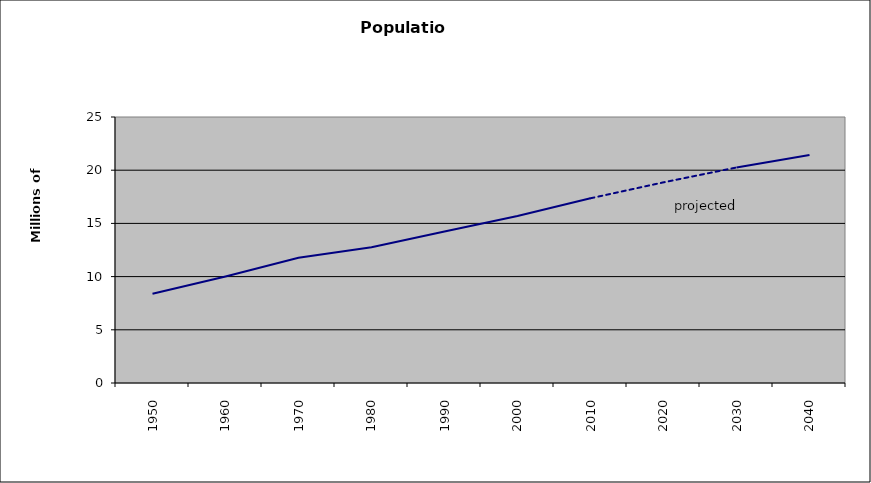
| Category | Series 0 |
|---|---|
| 1950.0 | 8.383 |
| 1960.0 | 10.01 |
| 1970.0 | 11.765 |
| 1980.0 | 12.75 |
| 1990.0 | 14.233 |
| 2000.0 | 15.699 |
| 2010.0 | 17.36 |
| 2020.0 | 18.858 |
| 2030.0 | 20.256 |
| 2040.0 | 21.422 |